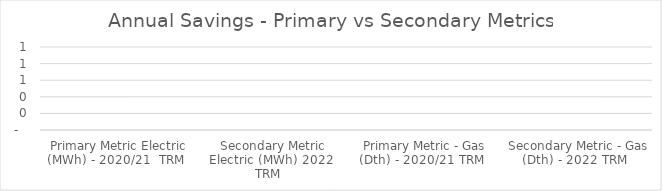
| Category | Series 0 |
|---|---|
| Primary Metric Electric (MWh) - 2020/21  TRM | 0 |
| Secondary Metric Electric (MWh) 2022 TRM | 0 |
| Primary Metric - Gas (Dth) - 2020/21 TRM | 0 |
| Secondary Metric - Gas (Dth) - 2022 TRM | 0 |